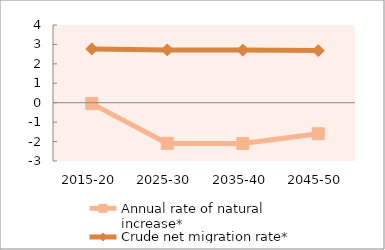
| Category | Annual rate of natural increase* | Crude net migration rate* |
|---|---|---|
| 2015-20 | -0.048 | 2.765 |
| 2025-30 | -2.094 | 2.718 |
| 2035-40 | -2.101 | 2.707 |
| 2045-50 | -1.598 | 2.682 |